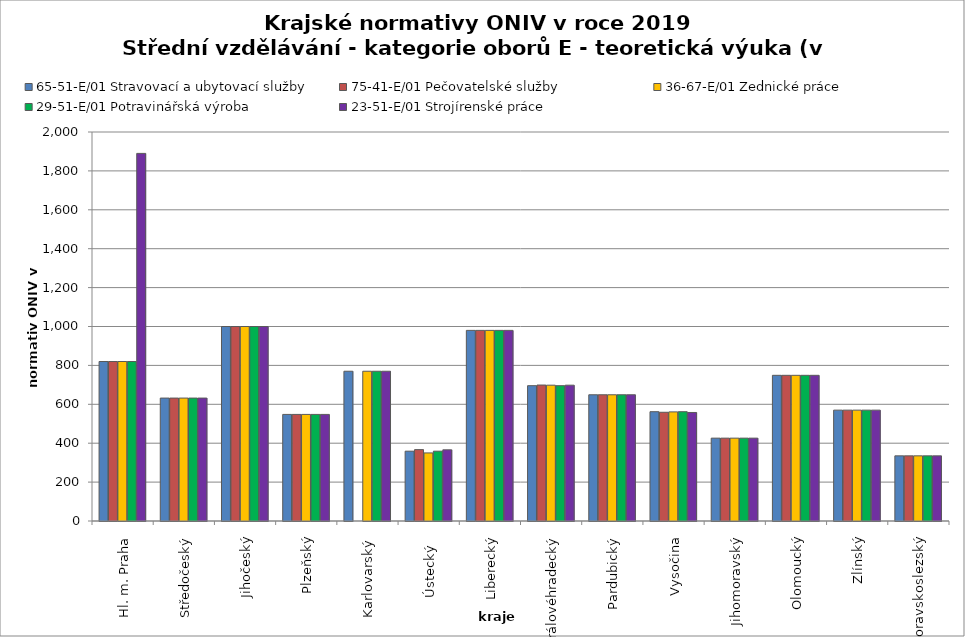
| Category | 65-51-E/01 Stravovací a ubytovací služby | 75-41-E/01 Pečovatelské služby | 36-67-E/01 Zednické práce | 29-51-E/01 Potravinářská výroba | 23-51-E/01 Strojírenské práce |
|---|---|---|---|---|---|
| Hl. m. Praha | 820 | 820 | 820 | 820 | 1890 |
| Středočeský | 632 | 632 | 632 | 632 | 632 |
| Jihočeský | 1000 | 1000 | 1000 | 1000 | 1000 |
| Plzeňský | 548 | 548 | 548 | 548 | 548 |
| Karlovarský  | 770 | 0 | 770 | 770 | 770 |
| Ústecký   | 359 | 367 | 350 | 359 | 366 |
| Liberecký | 980 | 980 | 980 | 980 | 980 |
| Královéhradecký | 695.7 | 699 | 698.3 | 695.7 | 698.3 |
| Pardubický | 649 | 649 | 649 | 649 | 649 |
| Vysočina | 562 | 559 | 561 | 562 | 558 |
| Jihomoravský | 426 | 426 | 426 | 426 | 426 |
| Olomoucký | 749 | 749 | 749 | 749 | 749 |
| Zlínský | 570 | 570 | 570 | 570 | 570 |
| Moravskoslezský | 335 | 335 | 335 | 335 | 335 |